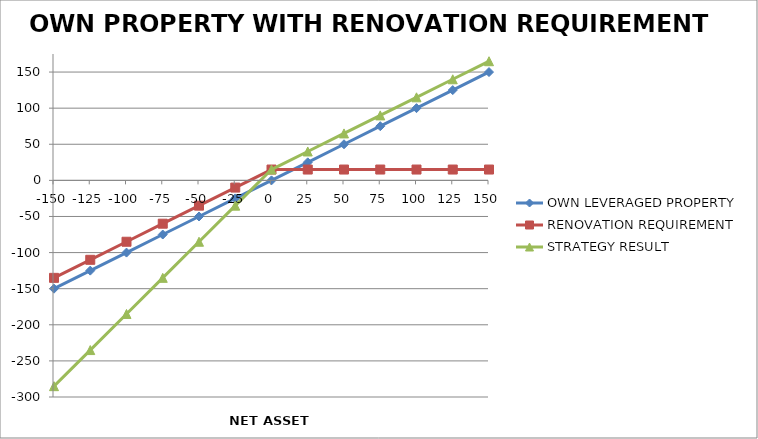
| Category | OWN LEVERAGED PROPERTY | RENOVATION REQUIREMENT | STRATEGY RESULT |
|---|---|---|---|
| -150.0 | -150 | -135 | -285 |
| -125.0 | -125 | -110 | -235 |
| -100.0 | -100 | -85 | -185 |
| -75.0 | -75 | -60 | -135 |
| -50.0 | -50 | -35 | -85 |
| -25.0 | -25 | -10 | -35 |
| 0.0 | 0 | 15 | 15 |
| 25.0 | 25 | 15 | 40 |
| 50.0 | 50 | 15 | 65 |
| 75.0 | 75 | 15 | 90 |
| 100.0 | 100 | 15 | 115 |
| 125.0 | 125 | 15 | 140 |
| 150.0 | 150 | 15 | 165 |